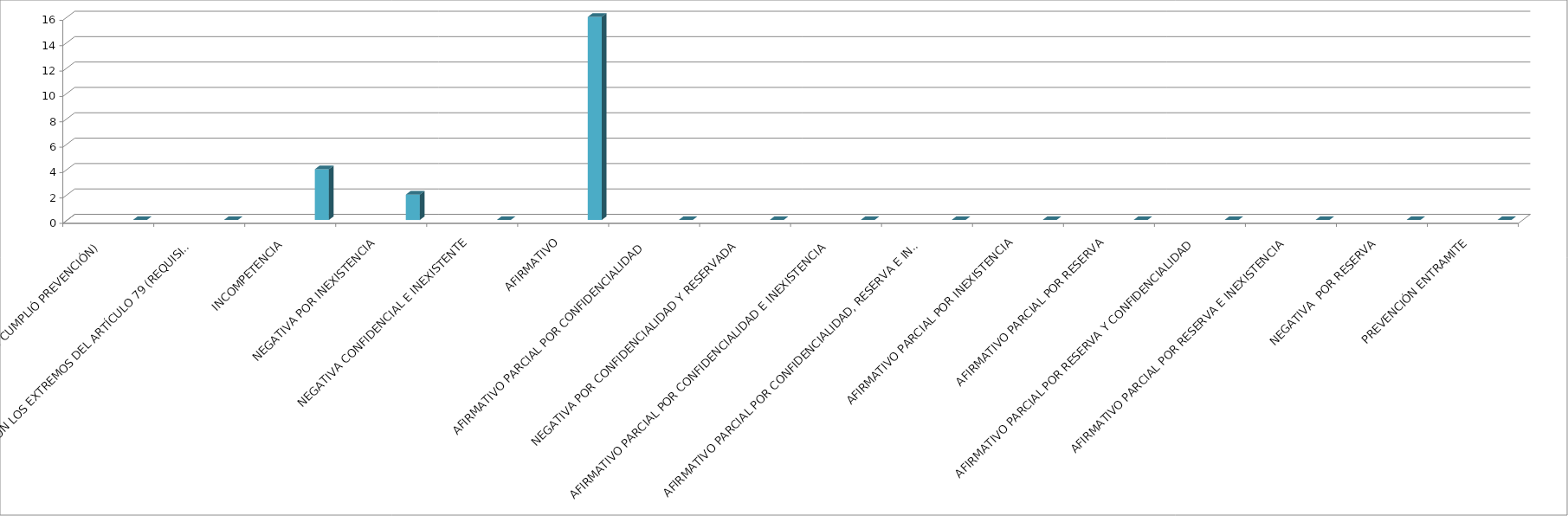
| Category | Series 0 | Series 1 | Series 2 | Series 3 | Series 4 |
|---|---|---|---|---|---|
| SE TIENE POR NO PRESENTADA ( NO CUMPLIÓ PREVENCIÓN) |  |  |  |  | 0 |
| NO CUMPLIO CON LOS EXTREMOS DEL ARTÍCULO 79 (REQUISITOS) |  |  |  |  | 0 |
| INCOMPETENCIA  |  |  |  |  | 4 |
| NEGATIVA POR INEXISTENCIA |  |  |  |  | 2 |
| NEGATIVA CONFIDENCIAL E INEXISTENTE |  |  |  |  | 0 |
| AFIRMATIVO |  |  |  |  | 16 |
| AFIRMATIVO PARCIAL POR CONFIDENCIALIDAD  |  |  |  |  | 0 |
| NEGATIVA POR CONFIDENCIALIDAD Y RESERVADA |  |  |  |  | 0 |
| AFIRMATIVO PARCIAL POR CONFIDENCIALIDAD E INEXISTENCIA |  |  |  |  | 0 |
| AFIRMATIVO PARCIAL POR CONFIDENCIALIDAD, RESERVA E INEXISTENCIA |  |  |  |  | 0 |
| AFIRMATIVO PARCIAL POR INEXISTENCIA |  |  |  |  | 0 |
| AFIRMATIVO PARCIAL POR RESERVA |  |  |  |  | 0 |
| AFIRMATIVO PARCIAL POR RESERVA Y CONFIDENCIALIDAD |  |  |  |  | 0 |
| AFIRMATIVO PARCIAL POR RESERVA E INEXISTENCIA |  |  |  |  | 0 |
| NEGATIVA  POR RESERVA |  |  |  |  | 0 |
| PREVENCIÓN ENTRAMITE |  |  |  |  | 0 |